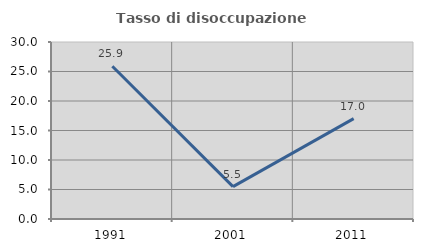
| Category | Tasso di disoccupazione giovanile  |
|---|---|
| 1991.0 | 25.893 |
| 2001.0 | 5.479 |
| 2011.0 | 17.021 |